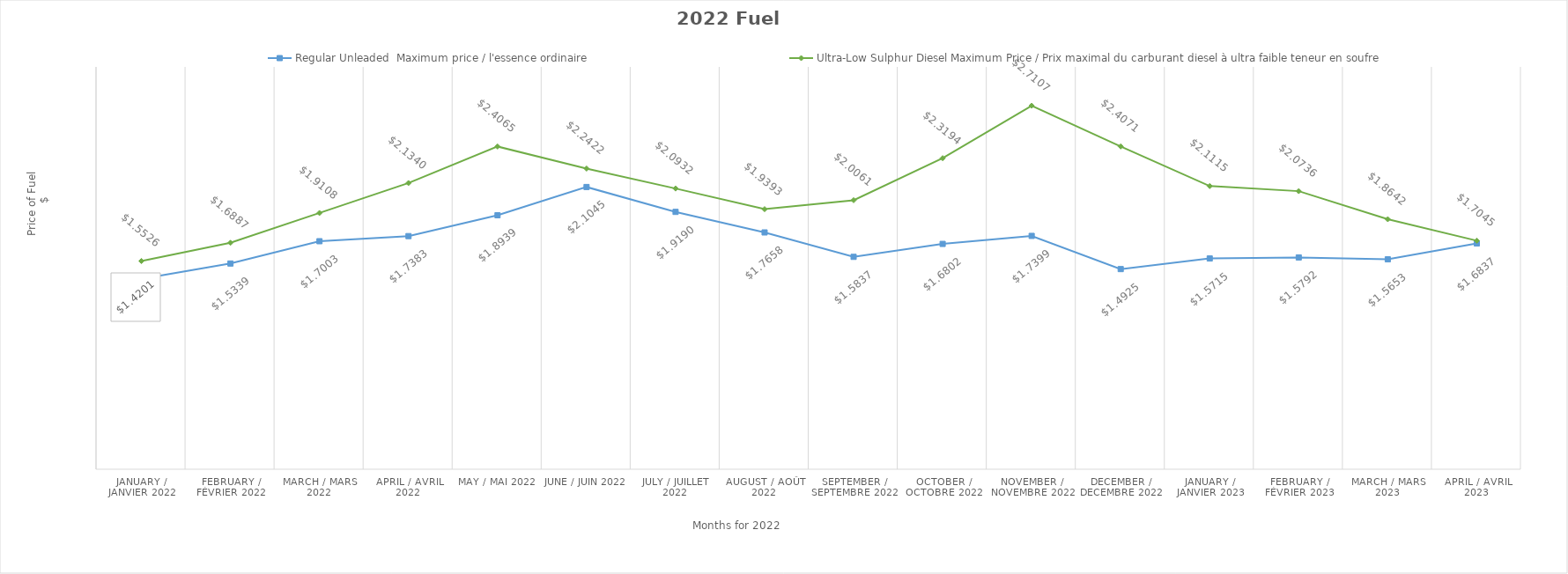
| Category | Regular Unleaded  Maximum price / l'essence ordinaire | Ultra-Low Sulphur Diesel Maximum Price / Prix maximal du carburant diesel à ultra faible teneur en soufre |
|---|---|---|
| January / janvier 2022 | 1.42 | 1.553 |
| February / février 2022 | 1.534 | 1.689 |
| March / mars 2022 | 1.7 | 1.911 |
| April / avril 2022 | 1.738 | 2.134 |
| May / mai 2022 | 1.894 | 2.406 |
| June / juin 2022 | 2.104 | 2.242 |
| July / juillet 2022 | 1.919 | 2.093 |
| August / août 2022 | 1.766 | 1.939 |
| September / septembre 2022 | 1.584 | 2.006 |
| October / octobre 2022 | 1.68 | 2.319 |
| November / novembre 2022 | 1.74 | 2.711 |
| December / decembre 2022 | 1.492 | 2.407 |
| January / janvier 2023 | 1.572 | 2.112 |
| February / février 2023 | 1.579 | 2.074 |
| March / mars 2023 | 1.565 | 1.864 |
| April / avril 2023 | 1.684 | 1.704 |